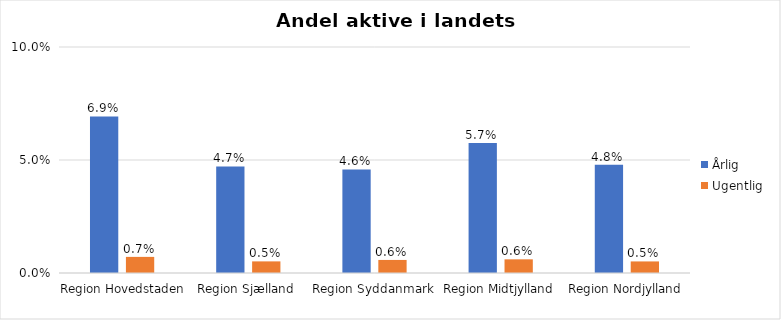
| Category | Årlig | Ugentlig |
|---|---|---|
| Region Hovedstaden | 0.069 | 0.007 |
| Region Sjælland | 0.047 | 0.005 |
| Region Syddanmark | 0.046 | 0.006 |
| Region Midtjylland | 0.057 | 0.006 |
| Region Nordjylland | 0.048 | 0.005 |